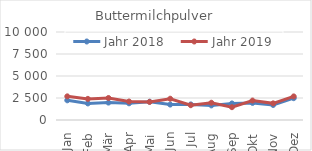
| Category | Jahr 2018 | Jahr 2019 |
|---|---|---|
| Jan | 2238.839 | 2687.386 |
| Feb | 1882.959 | 2399.851 |
| Mär | 1978.77 | 2501.549 |
| Apr | 1897.416 | 2099.177 |
| Mai | 2078.27 | 2057.338 |
| Jun | 1754.122 | 2418.166 |
| Jul | 1771.245 | 1680.47 |
| Aug | 1658.755 | 1961.036 |
| Sep | 1880.304 | 1456.988 |
| Okt | 1942.879 | 2210.146 |
| Nov | 1707.065 | 1891.286 |
| Dez | 2480.321 | 2682.027 |